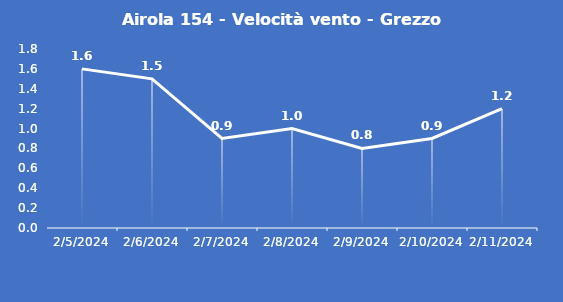
| Category | Airola 154 - Velocità vento - Grezzo (m/s) |
|---|---|
| 2/5/24 | 1.6 |
| 2/6/24 | 1.5 |
| 2/7/24 | 0.9 |
| 2/8/24 | 1 |
| 2/9/24 | 0.8 |
| 2/10/24 | 0.9 |
| 2/11/24 | 1.2 |